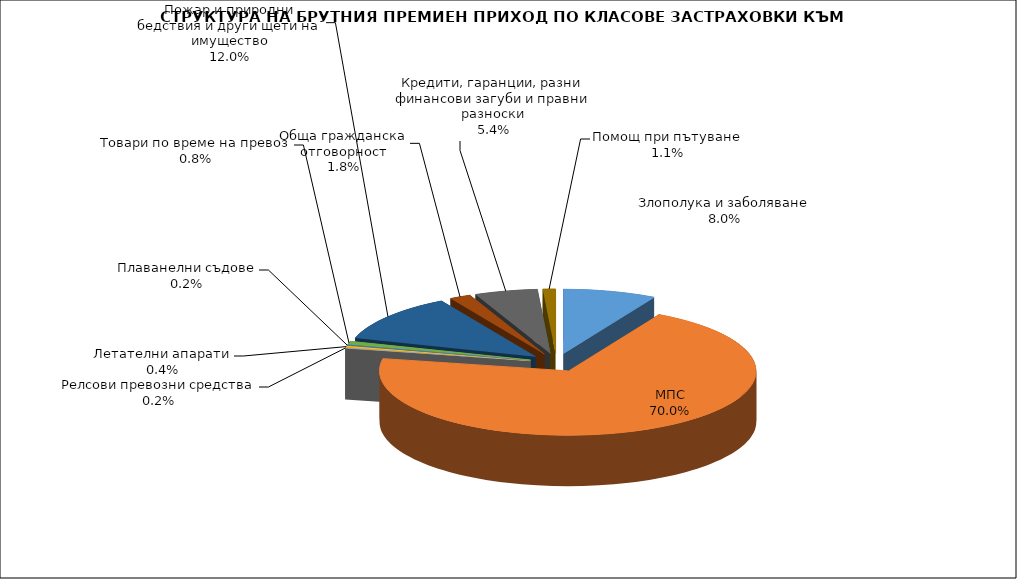
| Category | Злополука и заболяване |
|---|---|
| Злополука и заболяване | 0.08 |
| МПС | 0.7 |
| Релсови превозни средства | 0.002 |
| Летателни апарати | 0.004 |
| Плаванелни съдове | 0.002 |
| Товари по време на превоз | 0.008 |
| Пожар и природни бедствия и други щети на имущество | 0.12 |
| Обща гражданска отговорност | 0.018 |
| Кредити, гаранции, разни финансови загуби и правни разноски | 0.054 |
| Помощ при пътуване | 0.011 |